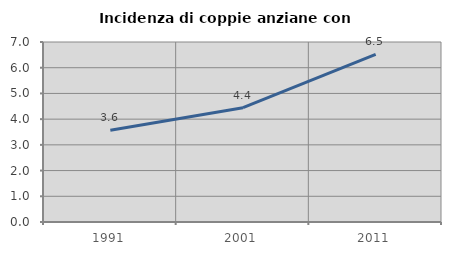
| Category | Incidenza di coppie anziane con figli |
|---|---|
| 1991.0 | 3.571 |
| 2001.0 | 4.444 |
| 2011.0 | 6.522 |